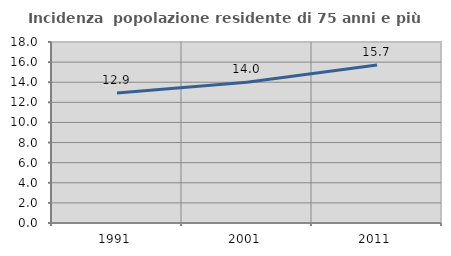
| Category | Incidenza  popolazione residente di 75 anni e più |
|---|---|
| 1991.0 | 12.931 |
| 2001.0 | 13.997 |
| 2011.0 | 15.705 |